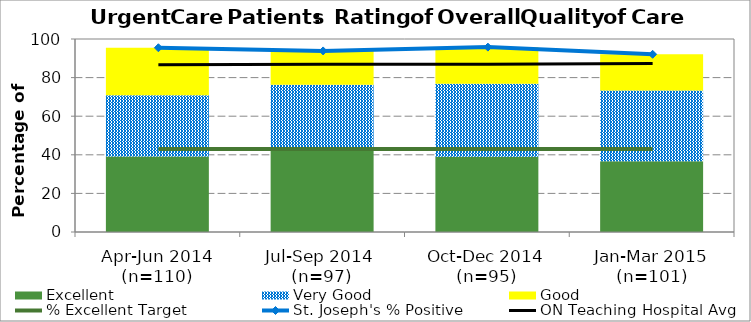
| Category | Excellent | Very Good | Good |
|---|---|---|---|
| Apr-Jun 2014 (n=110) | 39.09 | 31.82 | 24.55 |
| Jul-Sep 2014 
(n=97) | 43.3 | 32.99 | 17.53 |
| Oct-Dec 2014 (n=95) | 38.95 | 37.89 | 18.95 |
| Jan-Mar 2015 (n=101) | 36.63 | 36.63 | 18.81 |